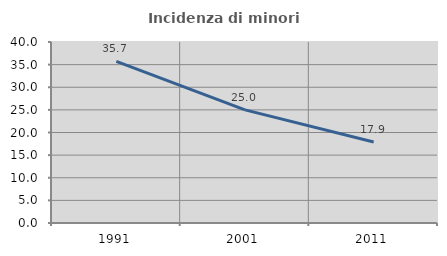
| Category | Incidenza di minori stranieri |
|---|---|
| 1991.0 | 35.714 |
| 2001.0 | 25 |
| 2011.0 | 17.91 |